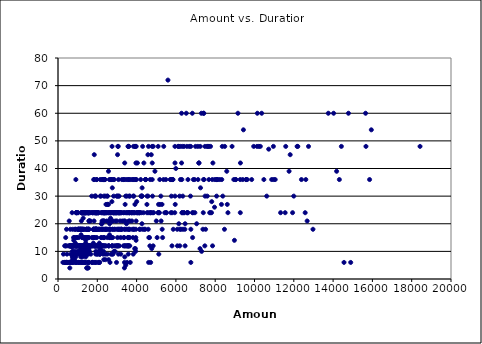
| Category | Amount vs. Duration |
|---|---|
| 1169.0 | 6 |
| 5951.0 | 48 |
| 2096.0 | 12 |
| 7882.0 | 42 |
| 4870.0 | 24 |
| 9055.0 | 36 |
| 2835.0 | 24 |
| 6948.0 | 36 |
| 3059.0 | 12 |
| 5234.0 | 30 |
| 1295.0 | 12 |
| 4308.0 | 48 |
| 1567.0 | 12 |
| 1199.0 | 24 |
| 1403.0 | 15 |
| 1282.0 | 24 |
| 2424.0 | 24 |
| 8072.0 | 30 |
| 12579.0 | 24 |
| 3430.0 | 24 |
| 2134.0 | 9 |
| 2647.0 | 6 |
| 2241.0 | 10 |
| 1804.0 | 12 |
| 2069.0 | 10 |
| 1374.0 | 6 |
| 426.0 | 6 |
| 409.0 | 12 |
| 2415.0 | 7 |
| 6836.0 | 60 |
| 1913.0 | 18 |
| 4020.0 | 24 |
| 5866.0 | 18 |
| 1264.0 | 12 |
| 1474.0 | 12 |
| 4746.0 | 45 |
| 6110.0 | 48 |
| 2100.0 | 18 |
| 1225.0 | 10 |
| 458.0 | 9 |
| 2333.0 | 30 |
| 1158.0 | 12 |
| 6204.0 | 18 |
| 6187.0 | 30 |
| 6143.0 | 48 |
| 1393.0 | 11 |
| 2299.0 | 36 |
| 1352.0 | 6 |
| 7228.0 | 11 |
| 2073.0 | 12 |
| 2333.0 | 24 |
| 5965.0 | 27 |
| 1262.0 | 12 |
| 3378.0 | 18 |
| 2225.0 | 36 |
| 783.0 | 6 |
| 6468.0 | 12 |
| 9566.0 | 36 |
| 1961.0 | 18 |
| 6229.0 | 36 |
| 1391.0 | 9 |
| 1537.0 | 15 |
| 1953.0 | 36 |
| 14421.0 | 48 |
| 3181.0 | 24 |
| 5190.0 | 27 |
| 2171.0 | 12 |
| 1007.0 | 12 |
| 1819.0 | 36 |
| 2394.0 | 36 |
| 8133.0 | 36 |
| 730.0 | 7 |
| 1164.0 | 8 |
| 5954.0 | 42 |
| 1977.0 | 36 |
| 1526.0 | 12 |
| 3965.0 | 42 |
| 4771.0 | 11 |
| 9436.0 | 54 |
| 3832.0 | 30 |
| 5943.0 | 24 |
| 1213.0 | 15 |
| 1568.0 | 18 |
| 1755.0 | 24 |
| 2315.0 | 10 |
| 1412.0 | 12 |
| 1295.0 | 18 |
| 12612.0 | 36 |
| 2249.0 | 18 |
| 1108.0 | 12 |
| 618.0 | 12 |
| 1409.0 | 12 |
| 797.0 | 12 |
| 3617.0 | 24 |
| 1318.0 | 12 |
| 15945.0 | 54 |
| 2012.0 | 12 |
| 2622.0 | 18 |
| 2337.0 | 36 |
| 7057.0 | 20 |
| 1469.0 | 24 |
| 2323.0 | 36 |
| 932.0 | 6 |
| 1919.0 | 9 |
| 2445.0 | 12 |
| 11938.0 | 24 |
| 6458.0 | 18 |
| 6078.0 | 12 |
| 7721.0 | 24 |
| 1410.0 | 14 |
| 1449.0 | 6 |
| 392.0 | 15 |
| 6260.0 | 18 |
| 7855.0 | 36 |
| 1680.0 | 12 |
| 3578.0 | 48 |
| 7174.0 | 42 |
| 2132.0 | 10 |
| 4281.0 | 33 |
| 2366.0 | 12 |
| 1835.0 | 21 |
| 3868.0 | 24 |
| 1768.0 | 12 |
| 781.0 | 10 |
| 1924.0 | 18 |
| 2121.0 | 12 |
| 701.0 | 12 |
| 639.0 | 12 |
| 1860.0 | 12 |
| 3499.0 | 12 |
| 8487.0 | 48 |
| 6887.0 | 36 |
| 2708.0 | 15 |
| 1984.0 | 18 |
| 10144.0 | 60 |
| 1240.0 | 12 |
| 8613.0 | 27 |
| 766.0 | 12 |
| 2728.0 | 15 |
| 1881.0 | 12 |
| 709.0 | 6 |
| 4795.0 | 36 |
| 3416.0 | 27 |
| 2462.0 | 18 |
| 2288.0 | 21 |
| 3566.0 | 48 |
| 860.0 | 6 |
| 682.0 | 12 |
| 5371.0 | 36 |
| 1582.0 | 18 |
| 1346.0 | 6 |
| 1924.0 | 10 |
| 5848.0 | 36 |
| 7758.0 | 24 |
| 6967.0 | 24 |
| 1282.0 | 12 |
| 1288.0 | 9 |
| 339.0 | 12 |
| 3512.0 | 24 |
| 1898.0 | 6 |
| 2872.0 | 24 |
| 1055.0 | 18 |
| 1262.0 | 15 |
| 7308.0 | 10 |
| 909.0 | 36 |
| 2978.0 | 6 |
| 1131.0 | 18 |
| 1577.0 | 11 |
| 3972.0 | 24 |
| 1935.0 | 24 |
| 950.0 | 15 |
| 763.0 | 12 |
| 2064.0 | 24 |
| 1414.0 | 8 |
| 3414.0 | 21 |
| 7485.0 | 30 |
| 2577.0 | 12 |
| 338.0 | 6 |
| 1963.0 | 12 |
| 571.0 | 21 |
| 9572.0 | 36 |
| 4455.0 | 36 |
| 1647.0 | 21 |
| 3777.0 | 24 |
| 884.0 | 18 |
| 1360.0 | 15 |
| 5129.0 | 9 |
| 1175.0 | 16 |
| 674.0 | 12 |
| 3244.0 | 18 |
| 4591.0 | 24 |
| 3844.0 | 48 |
| 3915.0 | 27 |
| 2108.0 | 6 |
| 3031.0 | 45 |
| 1501.0 | 9 |
| 1382.0 | 6 |
| 951.0 | 12 |
| 2760.0 | 24 |
| 4297.0 | 18 |
| 936.0 | 9 |
| 1168.0 | 12 |
| 5117.0 | 27 |
| 902.0 | 12 |
| 1495.0 | 12 |
| 10623.0 | 30 |
| 1935.0 | 12 |
| 1424.0 | 12 |
| 6568.0 | 24 |
| 1413.0 | 12 |
| 3074.0 | 9 |
| 3835.0 | 36 |
| 5293.0 | 27 |
| 1908.0 | 30 |
| 3342.0 | 36 |
| 932.0 | 6 |
| 3104.0 | 18 |
| 3913.0 | 36 |
| 3021.0 | 24 |
| 1364.0 | 10 |
| 625.0 | 12 |
| 1200.0 | 12 |
| 707.0 | 12 |
| 2978.0 | 24 |
| 4657.0 | 15 |
| 2613.0 | 36 |
| 10961.0 | 48 |
| 7865.0 | 12 |
| 1478.0 | 9 |
| 3149.0 | 24 |
| 4210.0 | 36 |
| 2507.0 | 9 |
| 2141.0 | 12 |
| 866.0 | 18 |
| 1544.0 | 4 |
| 1823.0 | 24 |
| 14555.0 | 6 |
| 2767.0 | 21 |
| 1291.0 | 12 |
| 2522.0 | 30 |
| 915.0 | 24 |
| 1595.0 | 6 |
| 4605.0 | 48 |
| 1185.0 | 12 |
| 3447.0 | 12 |
| 1258.0 | 24 |
| 717.0 | 12 |
| 1204.0 | 6 |
| 1925.0 | 24 |
| 433.0 | 18 |
| 666.0 | 6 |
| 2251.0 | 12 |
| 2150.0 | 30 |
| 4151.0 | 24 |
| 2030.0 | 9 |
| 7418.0 | 60 |
| 2684.0 | 24 |
| 2149.0 | 12 |
| 3812.0 | 15 |
| 1154.0 | 11 |
| 1657.0 | 12 |
| 1603.0 | 24 |
| 5302.0 | 18 |
| 2748.0 | 12 |
| 1231.0 | 10 |
| 802.0 | 15 |
| 6304.0 | 36 |
| 1533.0 | 24 |
| 8978.0 | 14 |
| 999.0 | 24 |
| 2662.0 | 18 |
| 1402.0 | 12 |
| 12169.0 | 48 |
| 3060.0 | 48 |
| 11998.0 | 30 |
| 2697.0 | 9 |
| 2404.0 | 18 |
| 1262.0 | 12 |
| 4611.0 | 6 |
| 1901.0 | 24 |
| 3368.0 | 15 |
| 1574.0 | 12 |
| 1445.0 | 18 |
| 1520.0 | 15 |
| 3878.0 | 24 |
| 10722.0 | 47 |
| 4788.0 | 48 |
| 7582.0 | 48 |
| 1092.0 | 12 |
| 1024.0 | 24 |
| 1076.0 | 12 |
| 9398.0 | 36 |
| 6419.0 | 24 |
| 4796.0 | 42 |
| 7629.0 | 48 |
| 9960.0 | 48 |
| 4675.0 | 12 |
| 1287.0 | 10 |
| 2515.0 | 18 |
| 2745.0 | 21 |
| 672.0 | 6 |
| 3804.0 | 36 |
| 1344.0 | 24 |
| 1038.0 | 10 |
| 10127.0 | 48 |
| 1543.0 | 6 |
| 4811.0 | 30 |
| 727.0 | 12 |
| 1237.0 | 8 |
| 276.0 | 9 |
| 5381.0 | 48 |
| 5511.0 | 24 |
| 3749.0 | 24 |
| 685.0 | 12 |
| 1494.0 | 4 |
| 2746.0 | 36 |
| 708.0 | 12 |
| 4351.0 | 24 |
| 701.0 | 12 |
| 3643.0 | 15 |
| 4249.0 | 30 |
| 1938.0 | 24 |
| 2910.0 | 24 |
| 2659.0 | 18 |
| 1028.0 | 18 |
| 3398.0 | 8 |
| 5801.0 | 12 |
| 1525.0 | 24 |
| 4473.0 | 36 |
| 1068.0 | 6 |
| 6615.0 | 24 |
| 1864.0 | 18 |
| 7408.0 | 60 |
| 11590.0 | 48 |
| 4110.0 | 24 |
| 3384.0 | 6 |
| 2101.0 | 13 |
| 1275.0 | 15 |
| 4169.0 | 24 |
| 1521.0 | 10 |
| 5743.0 | 24 |
| 3599.0 | 21 |
| 3213.0 | 18 |
| 4439.0 | 18 |
| 3949.0 | 10 |
| 1459.0 | 15 |
| 882.0 | 13 |
| 3758.0 | 24 |
| 1743.0 | 6 |
| 1136.0 | 9 |
| 1236.0 | 9 |
| 959.0 | 9 |
| 3229.0 | 18 |
| 6199.0 | 12 |
| 727.0 | 10 |
| 1246.0 | 24 |
| 2331.0 | 12 |
| 4463.0 | 36 |
| 776.0 | 12 |
| 2406.0 | 30 |
| 1239.0 | 18 |
| 3399.0 | 12 |
| 2247.0 | 12 |
| 1766.0 | 6 |
| 2473.0 | 18 |
| 1542.0 | 12 |
| 3850.0 | 18 |
| 3650.0 | 18 |
| 3446.0 | 36 |
| 3001.0 | 18 |
| 3079.0 | 36 |
| 6070.0 | 18 |
| 2146.0 | 10 |
| 13756.0 | 60 |
| 14782.0 | 60 |
| 7685.0 | 48 |
| 2320.0 | 18 |
| 846.0 | 7 |
| 14318.0 | 36 |
| 362.0 | 6 |
| 2212.0 | 20 |
| 12976.0 | 18 |
| 1283.0 | 22 |
| 1330.0 | 12 |
| 4272.0 | 30 |
| 2238.0 | 18 |
| 1126.0 | 18 |
| 7374.0 | 18 |
| 2326.0 | 15 |
| 1449.0 | 9 |
| 1820.0 | 18 |
| 983.0 | 12 |
| 3249.0 | 36 |
| 1957.0 | 6 |
| 2406.0 | 9 |
| 11760.0 | 39 |
| 2578.0 | 12 |
| 2348.0 | 36 |
| 1223.0 | 12 |
| 1516.0 | 24 |
| 1473.0 | 18 |
| 1887.0 | 18 |
| 8648.0 | 24 |
| 802.0 | 14 |
| 2899.0 | 18 |
| 2039.0 | 24 |
| 2197.0 | 24 |
| 1053.0 | 15 |
| 3235.0 | 24 |
| 939.0 | 12 |
| 1967.0 | 24 |
| 7253.0 | 33 |
| 2292.0 | 12 |
| 1597.0 | 10 |
| 1381.0 | 24 |
| 5842.0 | 36 |
| 2579.0 | 12 |
| 8471.0 | 18 |
| 2782.0 | 21 |
| 1042.0 | 18 |
| 3186.0 | 15 |
| 2028.0 | 12 |
| 958.0 | 12 |
| 1591.0 | 21 |
| 2762.0 | 12 |
| 2779.0 | 18 |
| 2743.0 | 28 |
| 1149.0 | 18 |
| 1313.0 | 9 |
| 1190.0 | 18 |
| 3448.0 | 5 |
| 11328.0 | 24 |
| 1872.0 | 6 |
| 2058.0 | 24 |
| 2136.0 | 9 |
| 1484.0 | 12 |
| 660.0 | 6 |
| 1287.0 | 24 |
| 3394.0 | 42 |
| 609.0 | 12 |
| 1884.0 | 12 |
| 1620.0 | 12 |
| 2629.0 | 20 |
| 719.0 | 12 |
| 5096.0 | 48 |
| 1244.0 | 9 |
| 1842.0 | 36 |
| 2576.0 | 7 |
| 1424.0 | 12 |
| 1512.0 | 15 |
| 11054.0 | 36 |
| 518.0 | 6 |
| 2759.0 | 12 |
| 2670.0 | 24 |
| 4817.0 | 24 |
| 2679.0 | 24 |
| 3905.0 | 11 |
| 3386.0 | 12 |
| 343.0 | 6 |
| 4594.0 | 18 |
| 3620.0 | 36 |
| 1721.0 | 15 |
| 3017.0 | 12 |
| 754.0 | 12 |
| 1950.0 | 18 |
| 2924.0 | 24 |
| 1659.0 | 24 |
| 7238.0 | 48 |
| 2764.0 | 33 |
| 4679.0 | 24 |
| 3092.0 | 24 |
| 448.0 | 6 |
| 654.0 | 9 |
| 1238.0 | 6 |
| 1245.0 | 18 |
| 3114.0 | 18 |
| 2569.0 | 39 |
| 5152.0 | 24 |
| 1037.0 | 12 |
| 1478.0 | 15 |
| 3573.0 | 12 |
| 1201.0 | 24 |
| 3622.0 | 30 |
| 960.0 | 15 |
| 1163.0 | 12 |
| 1209.0 | 6 |
| 3077.0 | 12 |
| 3757.0 | 24 |
| 1418.0 | 10 |
| 3518.0 | 6 |
| 1934.0 | 12 |
| 8318.0 | 27 |
| 1237.0 | 6 |
| 368.0 | 6 |
| 2122.0 | 12 |
| 2996.0 | 24 |
| 9034.0 | 36 |
| 1585.0 | 24 |
| 1301.0 | 18 |
| 1323.0 | 6 |
| 3123.0 | 24 |
| 5493.0 | 36 |
| 1126.0 | 9 |
| 1216.0 | 24 |
| 1207.0 | 24 |
| 1309.0 | 10 |
| 2360.0 | 15 |
| 6850.0 | 15 |
| 1413.0 | 24 |
| 8588.0 | 39 |
| 759.0 | 12 |
| 4686.0 | 36 |
| 2687.0 | 15 |
| 585.0 | 12 |
| 2255.0 | 24 |
| 609.0 | 6 |
| 1361.0 | 6 |
| 7127.0 | 36 |
| 1203.0 | 6 |
| 700.0 | 6 |
| 5507.0 | 24 |
| 3190.0 | 18 |
| 7119.0 | 48 |
| 3488.0 | 24 |
| 1113.0 | 18 |
| 7966.0 | 26 |
| 1532.0 | 15 |
| 1503.0 | 4 |
| 2302.0 | 36 |
| 662.0 | 6 |
| 2273.0 | 36 |
| 2631.0 | 15 |
| 1503.0 | 12 |
| 1311.0 | 24 |
| 3105.0 | 24 |
| 2319.0 | 21 |
| 1374.0 | 6 |
| 3612.0 | 18 |
| 7763.0 | 48 |
| 3049.0 | 18 |
| 1534.0 | 12 |
| 2032.0 | 24 |
| 6350.0 | 30 |
| 2864.0 | 18 |
| 1255.0 | 12 |
| 1333.0 | 24 |
| 2022.0 | 24 |
| 1552.0 | 24 |
| 626.0 | 12 |
| 8858.0 | 48 |
| 996.0 | 12 |
| 1750.0 | 6 |
| 6999.0 | 48 |
| 1995.0 | 12 |
| 1199.0 | 9 |
| 1331.0 | 12 |
| 2278.0 | 18 |
| 5003.0 | 21 |
| 3552.0 | 24 |
| 1928.0 | 18 |
| 2964.0 | 24 |
| 1546.0 | 24 |
| 683.0 | 6 |
| 12389.0 | 36 |
| 4712.0 | 24 |
| 1553.0 | 24 |
| 1372.0 | 12 |
| 2578.0 | 24 |
| 3979.0 | 48 |
| 6758.0 | 48 |
| 3234.0 | 24 |
| 5954.0 | 30 |
| 5433.0 | 24 |
| 806.0 | 15 |
| 1082.0 | 9 |
| 2788.0 | 15 |
| 2930.0 | 12 |
| 1927.0 | 24 |
| 2820.0 | 36 |
| 937.0 | 24 |
| 1056.0 | 18 |
| 3124.0 | 12 |
| 1388.0 | 9 |
| 2384.0 | 36 |
| 2133.0 | 12 |
| 2039.0 | 18 |
| 2799.0 | 9 |
| 1289.0 | 12 |
| 1217.0 | 18 |
| 2246.0 | 12 |
| 385.0 | 12 |
| 1965.0 | 24 |
| 1572.0 | 21 |
| 2718.0 | 24 |
| 1358.0 | 24 |
| 931.0 | 6 |
| 1442.0 | 24 |
| 4241.0 | 24 |
| 2775.0 | 18 |
| 3863.0 | 24 |
| 2329.0 | 7 |
| 918.0 | 9 |
| 1837.0 | 24 |
| 3349.0 | 36 |
| 1275.0 | 10 |
| 2828.0 | 24 |
| 4526.0 | 24 |
| 2671.0 | 36 |
| 2051.0 | 18 |
| 1300.0 | 15 |
| 741.0 | 12 |
| 1240.0 | 10 |
| 3357.0 | 21 |
| 3632.0 | 24 |
| 1808.0 | 18 |
| 12204.0 | 48 |
| 9157.0 | 60 |
| 3676.0 | 6 |
| 3441.0 | 30 |
| 640.0 | 12 |
| 3652.0 | 21 |
| 1530.0 | 18 |
| 3914.0 | 48 |
| 1858.0 | 12 |
| 2600.0 | 18 |
| 1979.0 | 15 |
| 2116.0 | 6 |
| 1437.0 | 9 |
| 4042.0 | 42 |
| 3832.0 | 9 |
| 3660.0 | 24 |
| 1553.0 | 18 |
| 1444.0 | 15 |
| 1980.0 | 9 |
| 1355.0 | 24 |
| 1393.0 | 12 |
| 1376.0 | 24 |
| 15653.0 | 60 |
| 1493.0 | 12 |
| 4370.0 | 42 |
| 750.0 | 18 |
| 1308.0 | 15 |
| 4623.0 | 15 |
| 1851.0 | 24 |
| 1880.0 | 18 |
| 7980.0 | 36 |
| 4583.0 | 30 |
| 1386.0 | 12 |
| 947.0 | 24 |
| 684.0 | 12 |
| 7476.0 | 48 |
| 1922.0 | 12 |
| 2303.0 | 24 |
| 8086.0 | 36 |
| 2346.0 | 24 |
| 3973.0 | 14 |
| 888.0 | 12 |
| 10222.0 | 48 |
| 4221.0 | 30 |
| 6361.0 | 18 |
| 1297.0 | 12 |
| 900.0 | 12 |
| 2241.0 | 21 |
| 1050.0 | 6 |
| 1047.0 | 6 |
| 6314.0 | 24 |
| 3496.0 | 30 |
| 3609.0 | 48 |
| 4843.0 | 12 |
| 3017.0 | 30 |
| 4139.0 | 24 |
| 5742.0 | 36 |
| 10366.0 | 60 |
| 2080.0 | 6 |
| 2580.0 | 21 |
| 4530.0 | 30 |
| 5150.0 | 24 |
| 5595.0 | 72 |
| 2384.0 | 24 |
| 1453.0 | 18 |
| 1538.0 | 6 |
| 2279.0 | 12 |
| 1478.0 | 15 |
| 5103.0 | 24 |
| 9857.0 | 36 |
| 6527.0 | 60 |
| 1347.0 | 10 |
| 2862.0 | 36 |
| 2753.0 | 9 |
| 3651.0 | 12 |
| 975.0 | 15 |
| 2631.0 | 15 |
| 2896.0 | 24 |
| 4716.0 | 6 |
| 2284.0 | 24 |
| 1236.0 | 6 |
| 1103.0 | 12 |
| 926.0 | 12 |
| 1800.0 | 18 |
| 1905.0 | 15 |
| 1123.0 | 12 |
| 6331.0 | 48 |
| 1377.0 | 24 |
| 2503.0 | 30 |
| 2528.0 | 27 |
| 5324.0 | 15 |
| 6560.0 | 48 |
| 2969.0 | 12 |
| 1206.0 | 9 |
| 2118.0 | 9 |
| 629.0 | 18 |
| 1198.0 | 6 |
| 2476.0 | 21 |
| 1138.0 | 9 |
| 14027.0 | 60 |
| 7596.0 | 30 |
| 3077.0 | 30 |
| 1505.0 | 18 |
| 3148.0 | 24 |
| 6148.0 | 20 |
| 1337.0 | 9 |
| 433.0 | 6 |
| 1228.0 | 12 |
| 790.0 | 9 |
| 2570.0 | 27 |
| 250.0 | 6 |
| 1316.0 | 15 |
| 1882.0 | 18 |
| 6416.0 | 48 |
| 1275.0 | 24 |
| 6403.0 | 24 |
| 1987.0 | 24 |
| 760.0 | 8 |
| 2603.0 | 24 |
| 3380.0 | 4 |
| 3990.0 | 36 |
| 11560.0 | 24 |
| 4380.0 | 18 |
| 6761.0 | 6 |
| 4280.0 | 30 |
| 2325.0 | 24 |
| 1048.0 | 10 |
| 3160.0 | 21 |
| 2483.0 | 24 |
| 14179.0 | 39 |
| 1797.0 | 13 |
| 2511.0 | 15 |
| 1274.0 | 12 |
| 5248.0 | 21 |
| 3029.0 | 15 |
| 428.0 | 6 |
| 976.0 | 18 |
| 841.0 | 12 |
| 5771.0 | 30 |
| 1555.0 | 12 |
| 1285.0 | 24 |
| 1299.0 | 6 |
| 1271.0 | 15 |
| 1393.0 | 24 |
| 691.0 | 12 |
| 5045.0 | 15 |
| 2124.0 | 18 |
| 2214.0 | 12 |
| 12680.0 | 21 |
| 2463.0 | 24 |
| 1155.0 | 12 |
| 3108.0 | 30 |
| 2901.0 | 10 |
| 3617.0 | 12 |
| 1655.0 | 12 |
| 2812.0 | 24 |
| 8065.0 | 36 |
| 3275.0 | 21 |
| 2223.0 | 24 |
| 1480.0 | 12 |
| 1371.0 | 24 |
| 3535.0 | 36 |
| 3509.0 | 18 |
| 5711.0 | 36 |
| 3872.0 | 18 |
| 4933.0 | 39 |
| 1940.0 | 24 |
| 1410.0 | 12 |
| 836.0 | 12 |
| 6468.0 | 20 |
| 1941.0 | 18 |
| 2675.0 | 22 |
| 2751.0 | 48 |
| 6224.0 | 48 |
| 5998.0 | 40 |
| 1188.0 | 21 |
| 6313.0 | 24 |
| 1221.0 | 6 |
| 2892.0 | 24 |
| 3062.0 | 24 |
| 2301.0 | 9 |
| 7511.0 | 18 |
| 1258.0 | 12 |
| 717.0 | 24 |
| 1549.0 | 9 |
| 1597.0 | 24 |
| 1795.0 | 18 |
| 4272.0 | 20 |
| 976.0 | 12 |
| 7472.0 | 12 |
| 9271.0 | 36 |
| 590.0 | 6 |
| 930.0 | 12 |
| 9283.0 | 42 |
| 1778.0 | 15 |
| 907.0 | 8 |
| 484.0 | 6 |
| 9629.0 | 36 |
| 3051.0 | 48 |
| 3931.0 | 48 |
| 7432.0 | 36 |
| 1338.0 | 6 |
| 1554.0 | 6 |
| 15857.0 | 36 |
| 1345.0 | 18 |
| 1101.0 | 12 |
| 3016.0 | 12 |
| 2712.0 | 36 |
| 731.0 | 8 |
| 3780.0 | 18 |
| 1602.0 | 21 |
| 3966.0 | 18 |
| 4165.0 | 18 |
| 8335.0 | 36 |
| 6681.0 | 48 |
| 2375.0 | 24 |
| 1216.0 | 18 |
| 11816.0 | 45 |
| 5084.0 | 24 |
| 2327.0 | 15 |
| 1082.0 | 12 |
| 886.0 | 12 |
| 601.0 | 4 |
| 2957.0 | 24 |
| 2611.0 | 24 |
| 5179.0 | 36 |
| 2993.0 | 21 |
| 1943.0 | 18 |
| 1559.0 | 24 |
| 3422.0 | 18 |
| 3976.0 | 21 |
| 6761.0 | 18 |
| 1249.0 | 24 |
| 1364.0 | 9 |
| 709.0 | 12 |
| 2235.0 | 20 |
| 4042.0 | 24 |
| 1471.0 | 15 |
| 1442.0 | 18 |
| 10875.0 | 36 |
| 1474.0 | 24 |
| 894.0 | 10 |
| 3343.0 | 15 |
| 3959.0 | 15 |
| 3577.0 | 9 |
| 5804.0 | 24 |
| 2169.0 | 18 |
| 2439.0 | 24 |
| 4526.0 | 27 |
| 2210.0 | 10 |
| 2221.0 | 15 |
| 2389.0 | 18 |
| 3331.0 | 12 |
| 7409.0 | 36 |
| 652.0 | 12 |
| 7678.0 | 36 |
| 1343.0 | 6 |
| 1382.0 | 24 |
| 874.0 | 15 |
| 3590.0 | 12 |
| 1322.0 | 11 |
| 1940.0 | 18 |
| 3595.0 | 36 |
| 1422.0 | 9 |
| 6742.0 | 30 |
| 7814.0 | 24 |
| 9277.0 | 24 |
| 2181.0 | 30 |
| 1098.0 | 18 |
| 4057.0 | 24 |
| 795.0 | 12 |
| 2825.0 | 24 |
| 15672.0 | 48 |
| 6614.0 | 36 |
| 7824.0 | 28 |
| 2442.0 | 27 |
| 1829.0 | 15 |
| 2171.0 | 12 |
| 5800.0 | 36 |
| 1169.0 | 18 |
| 8947.0 | 36 |
| 2606.0 | 21 |
| 1592.0 | 12 |
| 2186.0 | 15 |
| 4153.0 | 18 |
| 2625.0 | 16 |
| 3485.0 | 20 |
| 10477.0 | 36 |
| 1386.0 | 15 |
| 1278.0 | 24 |
| 1107.0 | 12 |
| 3763.0 | 21 |
| 3711.0 | 36 |
| 3594.0 | 15 |
| 3195.0 | 9 |
| 4454.0 | 36 |
| 4736.0 | 24 |
| 2991.0 | 30 |
| 2142.0 | 11 |
| 3161.0 | 24 |
| 18424.0 | 48 |
| 2848.0 | 10 |
| 14896.0 | 6 |
| 2359.0 | 24 |
| 3345.0 | 24 |
| 1817.0 | 18 |
| 12749.0 | 48 |
| 1366.0 | 9 |
| 2002.0 | 12 |
| 6872.0 | 24 |
| 697.0 | 12 |
| 1049.0 | 18 |
| 10297.0 | 48 |
| 1867.0 | 30 |
| 1344.0 | 12 |
| 1747.0 | 24 |
| 1670.0 | 9 |
| 1224.0 | 9 |
| 522.0 | 12 |
| 1498.0 | 12 |
| 1919.0 | 30 |
| 745.0 | 9 |
| 2063.0 | 6 |
| 6288.0 | 60 |
| 6842.0 | 24 |
| 3527.0 | 12 |
| 1546.0 | 10 |
| 929.0 | 24 |
| 1455.0 | 4 |
| 1845.0 | 15 |
| 8358.0 | 48 |
| 3349.0 | 24 |
| 2859.0 | 12 |
| 1533.0 | 18 |
| 3621.0 | 24 |
| 3590.0 | 18 |
| 2145.0 | 36 |
| 4113.0 | 24 |
| 10974.0 | 36 |
| 1893.0 | 12 |
| 1231.0 | 24 |
| 3656.0 | 30 |
| 1154.0 | 9 |
| 4006.0 | 28 |
| 3069.0 | 24 |
| 1740.0 | 6 |
| 2353.0 | 21 |
| 3556.0 | 15 |
| 2397.0 | 24 |
| 454.0 | 6 |
| 1715.0 | 30 |
| 2520.0 | 27 |
| 3568.0 | 15 |
| 7166.0 | 42 |
| 3939.0 | 11 |
| 1514.0 | 15 |
| 7393.0 | 24 |
| 1193.0 | 24 |
| 7297.0 | 60 |
| 2831.0 | 30 |
| 1258.0 | 24 |
| 753.0 | 6 |
| 2427.0 | 18 |
| 2538.0 | 24 |
| 1264.0 | 15 |
| 8386.0 | 30 |
| 4844.0 | 48 |
| 2923.0 | 21 |
| 8229.0 | 36 |
| 2028.0 | 24 |
| 1433.0 | 15 |
| 6289.0 | 42 |
| 1409.0 | 13 |
| 6579.0 | 24 |
| 1743.0 | 24 |
| 3565.0 | 12 |
| 1569.0 | 15 |
| 1936.0 | 18 |
| 3959.0 | 36 |
| 2390.0 | 12 |
| 1736.0 | 12 |
| 3857.0 | 30 |
| 804.0 | 12 |
| 1845.0 | 45 |
| 4576.0 | 45 |